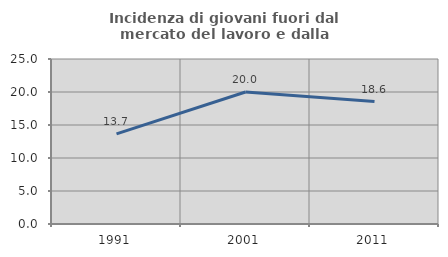
| Category | Incidenza di giovani fuori dal mercato del lavoro e dalla formazione  |
|---|---|
| 1991.0 | 13.665 |
| 2001.0 | 20 |
| 2011.0 | 18.552 |